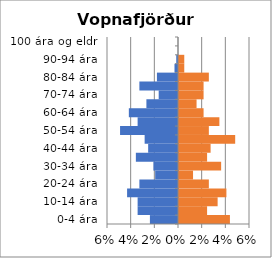
| Category | % karlar | %konur |
|---|---|---|
| 0-4 ára | -0.024 | 0.043 |
| 5-9 ára | -0.034 | 0.024 |
| 10-14 ára | -0.034 | 0.033 |
| 15-19 ára | -0.043 | 0.04 |
| 20-24 ára | -0.033 | 0.025 |
| 25-29 ára | -0.019 | 0.012 |
| 30-34 ára | -0.021 | 0.036 |
| 35-39 ára | -0.036 | 0.024 |
| 40-44 ára | -0.025 | 0.027 |
| 45-49 ára | -0.028 | 0.047 |
| 50-54 ára | -0.049 | 0.025 |
| 55-59 ára | -0.034 | 0.034 |
| 60-64 ára | -0.042 | 0.021 |
| 65-69 ára | -0.027 | 0.015 |
| 70-74 ára | -0.016 | 0.021 |
| 75-79 ára | -0.033 | 0.021 |
| 80-84 ára | -0.018 | 0.025 |
| 85-89 ára | -0.003 | 0.004 |
| 90-94 ára | -0.001 | 0.004 |
| 95-99 ára | 0 | 0 |
| 100 ára og eldri | 0 | 0 |